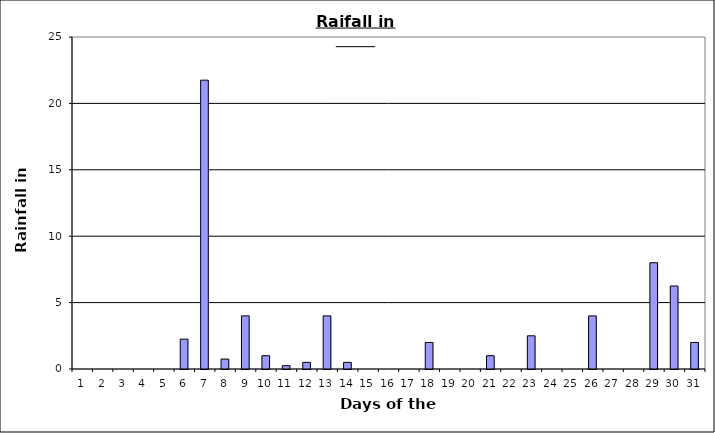
| Category | Series 0 |
|---|---|
| 0 | 0 |
| 1 | 0 |
| 2 | 0 |
| 3 | 0 |
| 4 | 0 |
| 5 | 2.25 |
| 6 | 21.75 |
| 7 | 0.75 |
| 8 | 4 |
| 9 | 1 |
| 10 | 0.25 |
| 11 | 0.5 |
| 12 | 4 |
| 13 | 0.5 |
| 14 | 0 |
| 15 | 0 |
| 16 | 0 |
| 17 | 2 |
| 18 | 0 |
| 19 | 0 |
| 20 | 1 |
| 21 | 0 |
| 22 | 2.5 |
| 23 | 0 |
| 24 | 0 |
| 25 | 4 |
| 26 | 0 |
| 27 | 0 |
| 28 | 8 |
| 29 | 6.25 |
| 30 | 2 |